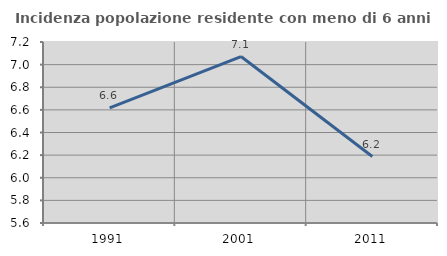
| Category | Incidenza popolazione residente con meno di 6 anni |
|---|---|
| 1991.0 | 6.618 |
| 2001.0 | 7.071 |
| 2011.0 | 6.188 |